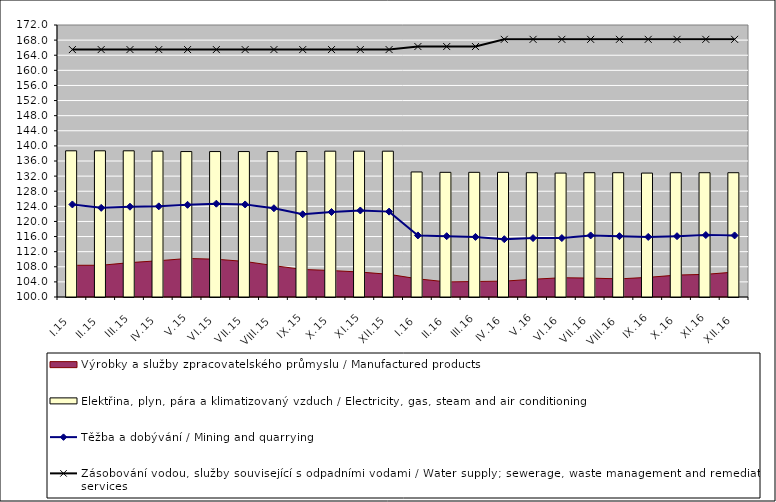
| Category | Elektřina, plyn, pára a klimatizovaný vzduch / Electricity, gas, steam and air conditioning |
|---|---|
| I.15 | 138.7 |
| II.15 | 138.7 |
| III.15 | 138.7 |
| IV.15 | 138.6 |
| V.15 | 138.5 |
| VI.15 | 138.5 |
| VII.15 | 138.5 |
| VIII.15 | 138.5 |
| IX.15 | 138.5 |
| X.15 | 138.6 |
| XI.15 | 138.6 |
| XII.15 | 138.6 |
| I.16 | 133.1 |
| II.16 | 133 |
| III.16 | 133 |
| IV.16 | 133 |
| V.16 | 132.9 |
| VI.16 | 132.8 |
| VII.16 | 132.9 |
| VIII.16 | 132.9 |
| IX.16 | 132.8 |
| X.16 | 132.9 |
| XI.16 | 132.9 |
| XII.16 | 132.9 |